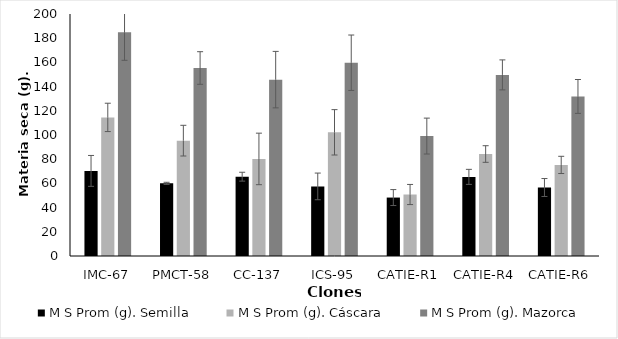
| Category | M S Prom (g). Semilla | M S Prom (g). Cáscara | M S Prom (g). Mazorca |
|---|---|---|---|
| IMC-67 | 70.327 | 114.54 | 184.867 |
| PMCT-58 | 60.047 | 95.327 | 155.37 |
| CC-137 | 65.543 | 80.22 | 145.76 |
| ICS-95 | 57.517 | 102.213 | 159.733 |
| CATIE-R1 | 48.3 | 50.823 | 99.12 |
| CATIE-R4 | 65.39 | 84.287 | 149.677 |
| CATIE-R6 | 56.597 | 75.277 | 131.873 |